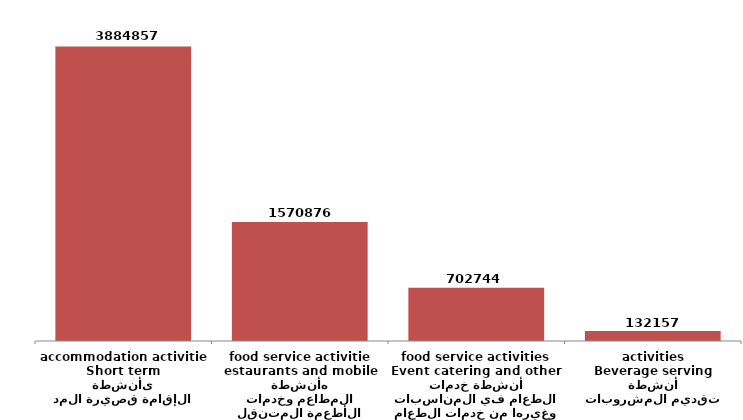
| Category | Series 0 |
|---|---|
| أنشطة الإقامة قصيرة المدى
Short term accommodation activities | 3884857 |
| أنشطة المطاعم وخدمات الأطعمة المتنقله
estaurants and mobile food service activities | 1570876 |
| أنشطة خدمات الطعام في المناسبات وغيرها من خدمات الطعام
Event catering and other food service activities | 702744 |
| أنشطة تقديم المشروبات
Beverage serving activities | 132157 |